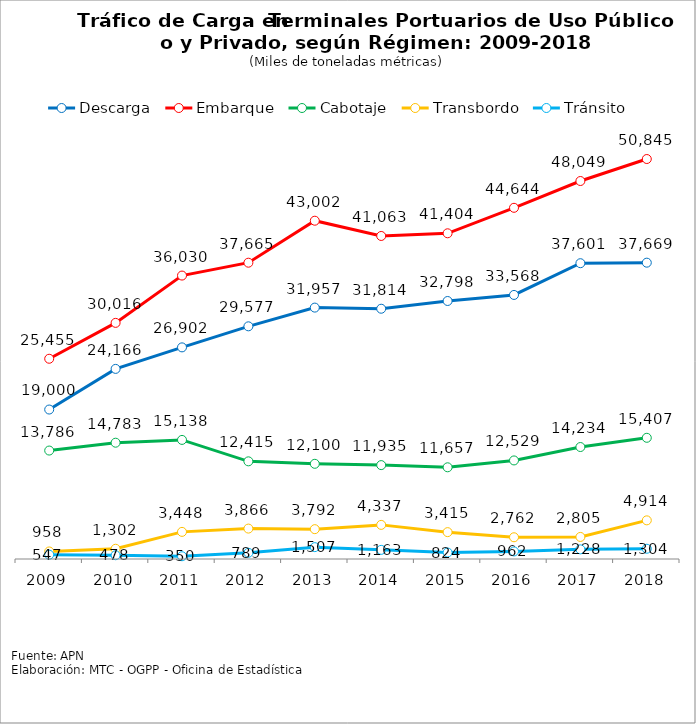
| Category | Descarga | Embarque | Cabotaje | Transbordo | Tránsito |
|---|---|---|---|---|---|
| 2009.0 | 19000 | 25455 | 13786 | 958 | 547 |
| 2010.0 | 24166 | 30016 | 14783 | 1302 | 478 |
| 2011.0 | 26902 | 36030 | 15138 | 3448 | 350 |
| 2012.0 | 29577 | 37665 | 12415 | 3866 | 789 |
| 2013.0 | 31957.083 | 43002.12 | 12100.175 | 3792.202 | 1506.822 |
| 2014.0 | 31814.126 | 41063.445 | 11935.319 | 4337.09 | 1163.192 |
| 2015.0 | 32797.604 | 41403.722 | 11657.447 | 3414.855 | 824.359 |
| 2016.0 | 33567.683 | 44644.036 | 12529.254 | 2762.206 | 961.766 |
| 2017.0 | 37600.83 | 48049.245 | 14233.905 | 2805.076 | 1227.975 |
| 2018.0 | 37669.109 | 50845.106 | 15406.95 | 4913.902 | 1303.744 |